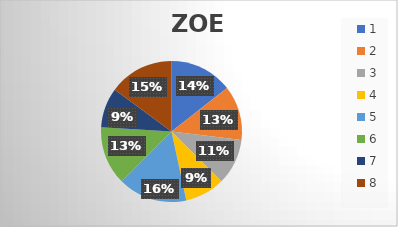
| Category | ZOE |
|---|---|
| 0 | 30 |
| 1 | 26 |
| 2 | 22 |
| 3 | 19 |
| 4 | 33 |
| 5 | 28 |
| 6 | 19 |
| 7 | 31 |